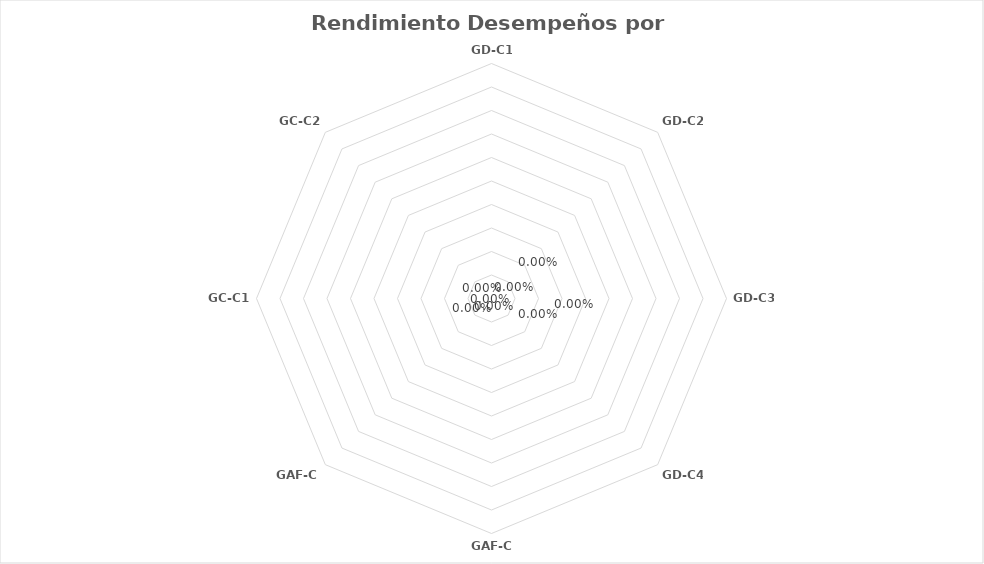
| Category | Series 0 |
|---|---|
| GD-C1 | 0 |
| GD-C2 | 0 |
| GD-C3 | 0 |
| GD-C4 | 0 |
| GAF-C1 | 0 |
| GAF-C2 | 0 |
| GC-C1 | 0 |
| GC-C2 | 0 |